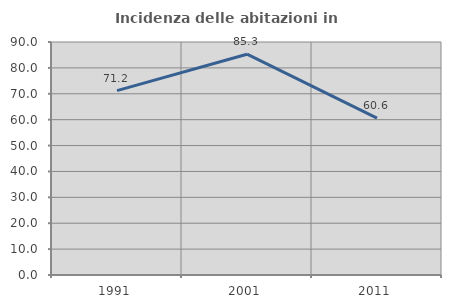
| Category | Incidenza delle abitazioni in proprietà  |
|---|---|
| 1991.0 | 71.222 |
| 2001.0 | 85.283 |
| 2011.0 | 60.598 |